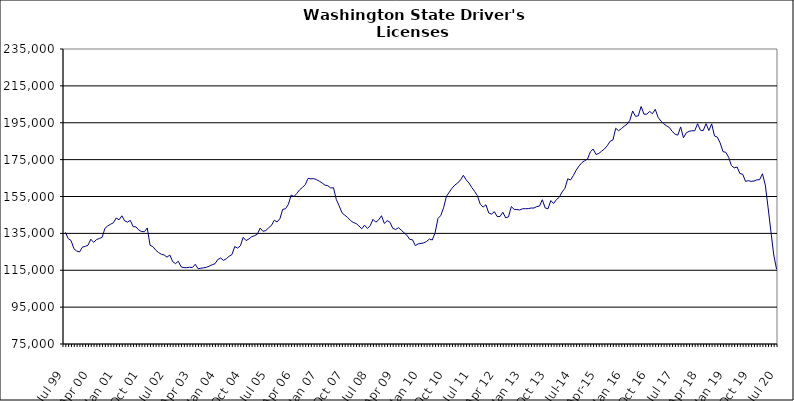
| Category | Series 0 |
|---|---|
| Jul 99 | 135560 |
| Aug 99 | 132182 |
| Sep 99 | 131104 |
| Oct 99 | 126694 |
| Nov 99 | 125425 |
| Dec 99 | 124927 |
| Jan 00 | 127499 |
| Feb 00 | 127927 |
| Mar 00 | 128547 |
| Apr 00 | 131834 |
| May 00 | 130120 |
| Jun 00 | 131595 |
| Jul 00 | 132236 |
| Aug 00 | 132819 |
| Sep 00 | 137711 |
| Oct 00 | 139063 |
| Nov 00 | 139952 |
| Dec 00 | 140732 |
| Jan 01 | 143338 |
| Feb 01 | 142359 |
| Mar 01 | 144523 |
| Apr 01 | 141758 |
| May 01 | 141135 |
| Jun 01 | 142064 |
| Jul 01 | 138646 |
| Aug 01 | 138530 |
| Sep 01 | 136784 |
| Oct 01 | 135996 |
| Nov 01 | 135917 |
| Dec 01 | 137940 |
| Jan 02 | 128531 |
| Feb 02 | 127848 |
| Mar 02 | 125876 |
| Apr 02 | 124595 |
| May 02 | 123660 |
| Jun 02 | 123282 |
| Jul 02 | 122089 |
| Aug 02 | 123279 |
| Sep 02 | 119727 |
| Oct 02 | 118588 |
| Nov 02 | 119854 |
| Dec 02 | 116851 |
| Jan 03 | 116407 |
| Feb 03 | 116382 |
| Mar 03 | 116648 |
| Apr 03 | 116471 |
| May 03 | 118231 |
| Jun 03 | 115831 |
| Jul 03 | 116082 |
| Aug 03 | 116341 |
| Sep 03 | 116653 |
| Oct 03 | 117212 |
| Nov 03 | 117962 |
| Dec 03 | 118542 |
| Jan 04 | 120817 |
| Feb 04 | 121617 |
| Mar 04 | 120369 |
| Apr 04 | 121200 |
| May 04 | 122609 |
| Jun 04 | 123484 |
| Jul 04 | 127844 |
| Aug 04 | 127025 |
| Sep 04 | 128273 |
| Oct 04 | 132853 |
| Nov 04 | 131106 |
| Dec 04 | 131935 |
| Jan 05 | 133205 |
| Feb 05 | 133736 |
| Mar 05 | 134528 |
| Apr 05 | 137889 |
| May 05 | 136130 |
| Jun 05 | 136523 |
| Jul 05 | 137997 |
| Aug 05 | 139294 |
| Sep 05 | 142140 |
| Oct 05 | 141192 |
| Nov 05 | 142937 |
| Dec 05 | 148013 |
| Jan 06 | 148341 |
| Feb 06 | 150744 |
| Mar 06 | 155794 |
| Apr 06 | 154984 |
| May 06 | 156651 |
| Jun 06 | 158638 |
| Jul 06 | 159911 |
| Aug 06 | 161445 |
| Sep 06 | 164852 |
| Oct 06 | 164570 |
| Nov 06 | 164679 |
| Dec 06 | 164127 |
| Jan 07 | 163271 |
| Feb 07 | 162273 |
| Mar 07 | 161140 |
| Apr 07 | 160860 |
| May 07 | 159633 |
| Jun 07 | 159724 |
| Jul 07 | 153303 |
| Aug 07 | 149939 |
| Sep 07 | 146172 |
| Oct 07 | 144876 |
| Nov 07 | 143613 |
| Dec 07 | 142022 |
| Jan 08 | 140909 |
| Feb 08 | 140368 |
| Mar 08 | 138998 |
| Apr 08 | 137471 |
| May 08 | 139453 |
| Jun 08 | 137680 |
| Jul 08 | 139120 |
| Aug 08 | 142612 |
| Sep-08 | 141071 |
| Oct 08 | 142313 |
| Nov 08 | 144556 |
| Dec 08 | 140394 |
| Jan 09 | 141903 |
| Feb 09 | 141036 |
| Mar 09 | 137751 |
| Apr 09 | 137060 |
| May 09 | 138101 |
| Jun 09 | 136739 |
| Jul 09 | 135317 |
| Aug 09 | 134020 |
| Sep 09 | 131756 |
| Oct 09 | 131488 |
| Nov 09 | 128370 |
| Dec 09 | 129323 |
| Jan 10 | 129531 |
| Feb 10 | 129848 |
| Mar 10 | 130654 |
| Apr 10 | 131929 |
| May 10 | 131429 |
| Jun 10 | 135357 |
| Jul 10 | 143032 |
| Aug 10 | 144686 |
| Sep 10 | 148856 |
| Oct 10 | 155042 |
| Nov 10 | 157328 |
| Dec 10 | 159501 |
| Jan 11 | 161221 |
| Feb 11 | 162312 |
| Mar 11 | 163996 |
| Apr 11 | 166495 |
| May 11 | 164040 |
| Jun 11 | 162324 |
| Jul 11 | 159862 |
| Aug 11 | 157738 |
| Sep 11 | 155430 |
| Oct 11 | 150762 |
| Nov 11 | 149255 |
| Dec 11 | 150533 |
| Jan 12 | 146068 |
| Feb 12 | 145446 |
| Mar 12 | 146788 |
| Apr 12 | 144110 |
| May 12 | 144162 |
| Jun 12 | 146482 |
| Jul 12 | 143445 |
| Aug 12 | 143950 |
| Sep 12 | 149520 |
| Oct 12 | 148033 |
| Nov 12 | 147926 |
| Dec 12 | 147674 |
| Jan 13 | 148360 |
| Feb-13 | 148388 |
| Mar-13 | 148414 |
| Apr 13 | 148749 |
| May 13 | 148735 |
| Jun-13 | 149521 |
| Jul 13 | 149837 |
| Aug 13 | 153252 |
| Sep 13 | 148803 |
| Oct 13 | 148315 |
| Nov 13 | 152804 |
| Dec 13 | 151209 |
| Jan 14 | 153357 |
| Feb-14 | 154608 |
| Mar 14 | 157479 |
| Apr 14 | 159441 |
| May 14 | 164591 |
| Jun 14 | 163995 |
| Jul-14 | 166411 |
| Aug-14 | 169272 |
| Sep 14 | 171565 |
| Oct 14 | 173335 |
| Nov 14 | 174406 |
| Dec 14 | 175302 |
| Jan 15 | 179204 |
| Feb 15 | 180737 |
| Mar 15 | 177810 |
| Apr-15 | 178331 |
| May 15 | 179601 |
| Jun-15 | 180729 |
| Jul 15 | 182540 |
| Aug 15 | 184924 |
| Sep 15 | 185620 |
| Oct 15 | 192002 |
| Nov 15 | 190681 |
| Dec 15 | 191795 |
| Jan 16 | 193132 |
| Feb 16 | 194206 |
| Mar 16 | 196319 |
| Apr 16 | 201373 |
| May 16 | 198500 |
| Jun 16 | 198743 |
| Jul 16 | 203841 |
| Aug 16 | 199630 |
| Sep 16 | 199655 |
| Oct 16 | 201181 |
| Nov 16 | 199888 |
| Dec 16 | 202304 |
| Jan 17 | 197977 |
| Feb 17 | 195889 |
| Mar 17 | 194438 |
| Apr 17 | 193335 |
| May 17 | 192430 |
| Jun 17 | 190298 |
| Jul 17 | 188832 |
| Aug 17 | 188264 |
| Sep 17 | 192738 |
| Oct 17 | 186856 |
| Nov 17 | 189537 |
| Dec 17 | 190341 |
| Jan 18 | 190670 |
| Feb 18 | 190645 |
| Mar 18 | 194476 |
| Apr 18 | 190971 |
| May 18 | 190707 |
| Jun 18 | 194516 |
| Jul 18 | 190783 |
| Aug 18 | 194390 |
| Sep 18 | 187831 |
| Oct 18 | 187188 |
| Nov 18 | 184054 |
| Dec 18 | 179347 |
| Jan 19 | 178958 |
| Feb 19 | 176289 |
| Mar 19 | 171747 |
| Apr 19 | 170532 |
| May 19 | 170967 |
| Jun 19 | 167444 |
| Jul 19 | 167059 |
| Aug 19 | 163194 |
| Sep 19 | 163599 |
| Oct 19 | 163212 |
| Nov 19 | 163388 |
| Dec 19 | 164024 |
| Jan 20 | 164114 |
| Feb 20 | 167320 |
| Mar 20 | 161221 |
| Apr 20 | 148866 |
| May 20 | 135821 |
| Jun 20 | 123252 |
| Jul 20 | 115526 |